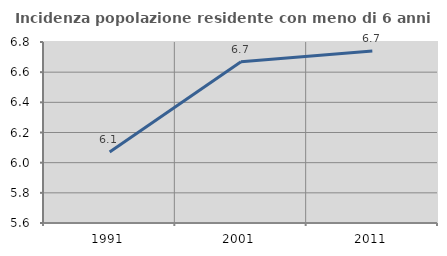
| Category | Incidenza popolazione residente con meno di 6 anni |
|---|---|
| 1991.0 | 6.071 |
| 2001.0 | 6.669 |
| 2011.0 | 6.74 |